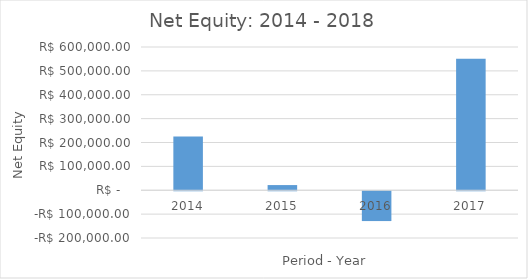
| Category | Series 0 |
|---|---|
| 2014.0 | 225636.16 |
| 2015.0 | 21693.59 |
| 2016.0 | -124899.87 |
| 2017.0 | 550873.06 |